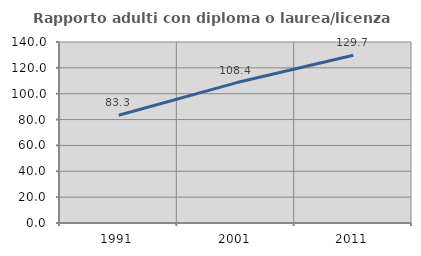
| Category | Rapporto adulti con diploma o laurea/licenza media  |
|---|---|
| 1991.0 | 83.333 |
| 2001.0 | 108.422 |
| 2011.0 | 129.702 |